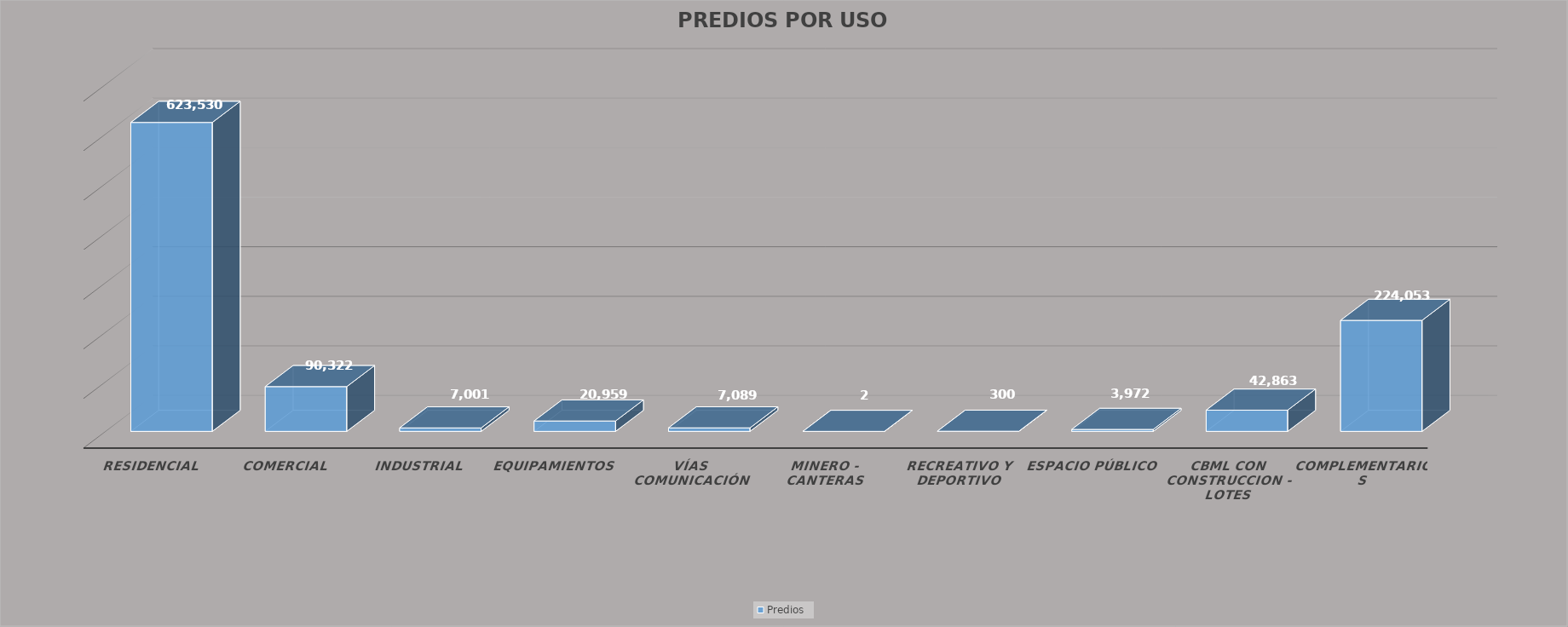
| Category | Predios |
|---|---|
| RESIDENCIAL | 623530 |
| COMERCIAL | 90322 |
| INDUSTRIAL | 7001 |
| EQUIPAMIENTOS | 20959 |
| VÍAS COMUNICACIÓN | 7089 |
| MINERO - CANTERAS | 2 |
| RECREATIVO Y DEPORTIVO | 300 |
| ESPACIO PÚBLICO | 3972 |
| CBML CON CONSTRUCCION - LOTES | 42863 |
| COMPLEMENTARIOS | 224053 |